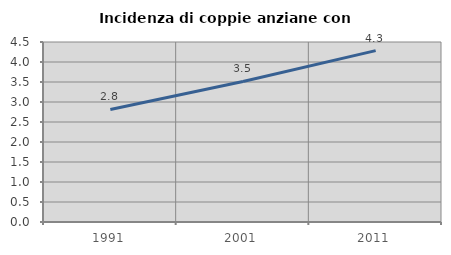
| Category | Incidenza di coppie anziane con figli |
|---|---|
| 1991.0 | 2.815 |
| 2001.0 | 3.513 |
| 2011.0 | 4.285 |